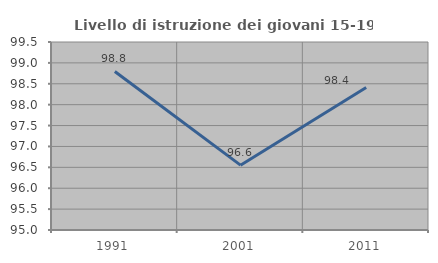
| Category | Livello di istruzione dei giovani 15-19 anni |
|---|---|
| 1991.0 | 98.795 |
| 2001.0 | 96.552 |
| 2011.0 | 98.413 |